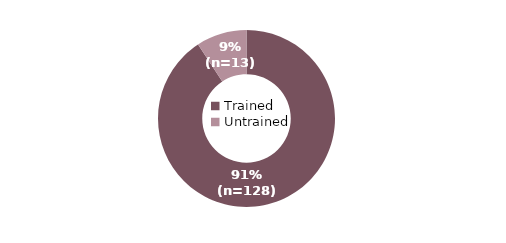
| Category | Series 0 |
|---|---|
| Trained | 128 |
| Untrained | 13 |